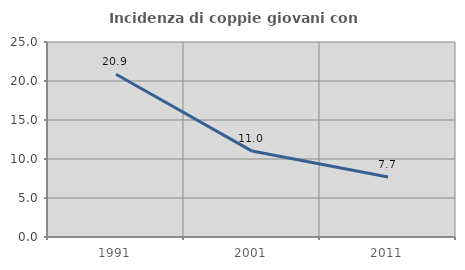
| Category | Incidenza di coppie giovani con figli |
|---|---|
| 1991.0 | 20.867 |
| 2001.0 | 11.014 |
| 2011.0 | 7.684 |